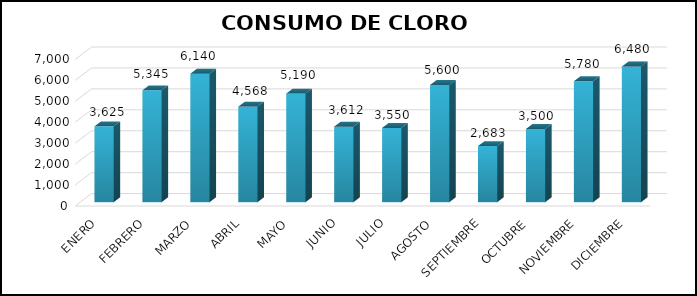
| Category | Series 0 |
|---|---|
| ENERO | 3625 |
| FEBRERO | 5345 |
| MARZO | 6140 |
| ABRIL | 4568 |
| MAYO | 5190 |
| JUNIO | 3612 |
| JULIO | 3550 |
| AGOSTO | 5600 |
| SEPTIEMBRE | 2683 |
| OCTUBRE | 3500 |
| NOVIEMBRE | 5780 |
| DICIEMBRE | 6480 |